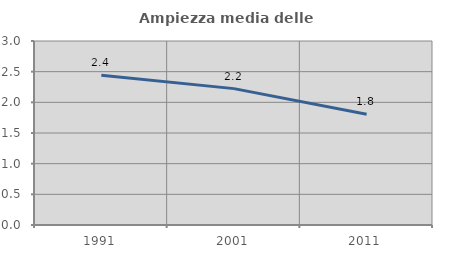
| Category | Ampiezza media delle famiglie |
|---|---|
| 1991.0 | 2.441 |
| 2001.0 | 2.224 |
| 2011.0 | 1.807 |